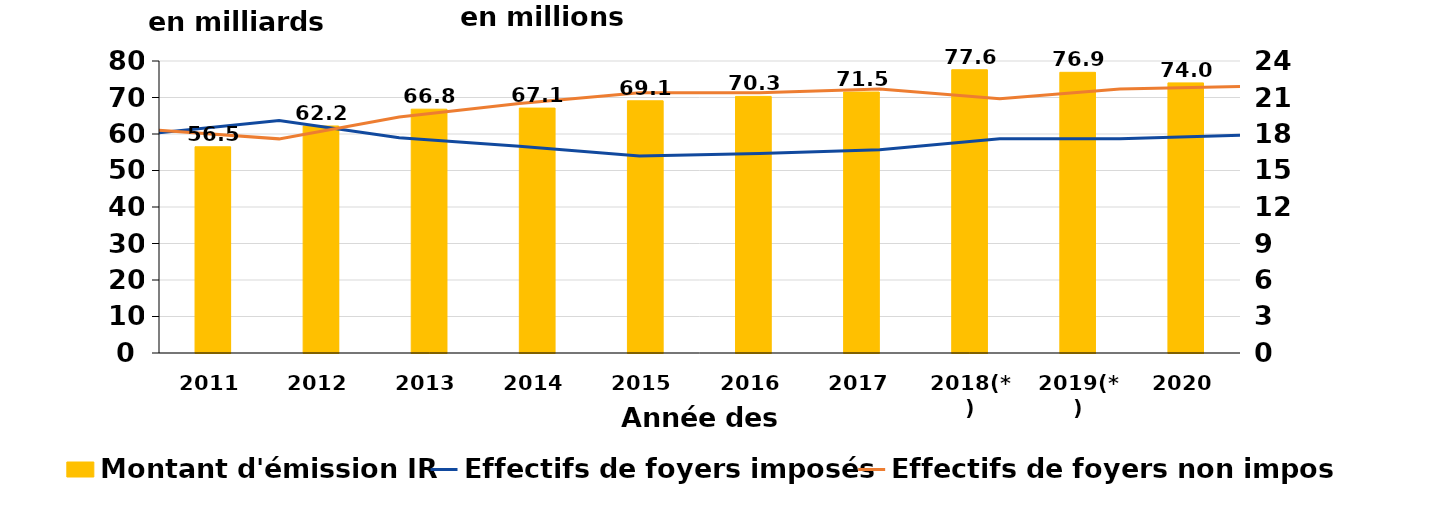
| Category | Montant d'émission IR |
|---|---|
| 2011 | 56.5 |
| 2012 | 62.2 |
| 2013 | 66.8 |
| 2014 | 67.1 |
| 2015 | 69.1 |
| 2016 | 70.3 |
| 2017 | 71.5 |
| 2018(*) | 77.6 |
| 2019(*) | 76.9 |
| 2020 | 74 |